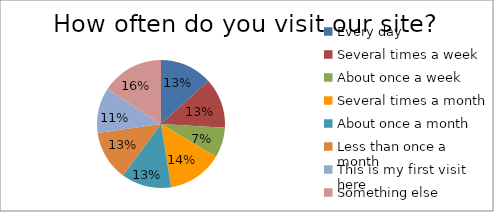
| Category | Options |
|---|---|
| Every day | 21 |
| Several times a week | 20 |
| About once a week | 12 |
| Several times a month | 22 |
| About once a month | 20 |
| Less than once a month | 20 |
| This is my first visit here | 18 |
| Something else | 25 |